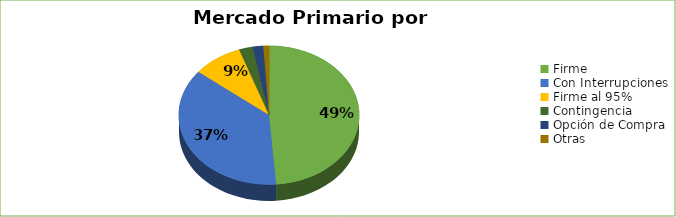
| Category | Series 0 |
|---|---|
| Firme | 1092129 |
| Con Interrupciones | 828671 |
| Firme al 95% | 200142 |
| Contingencia | 55639 |
| Opción de Compra | 41800 |
| Otras | 22685 |